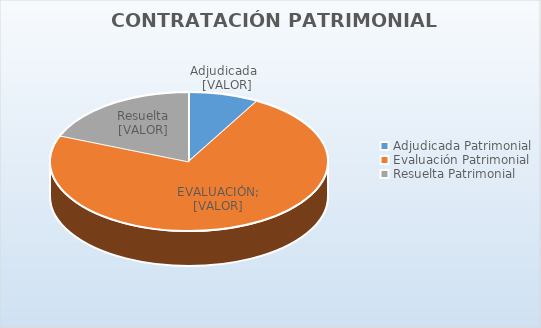
| Category | Total |
|---|---|
| 0 | 93600 |
| 1 | 835073.79 |
| 2 | 216600 |